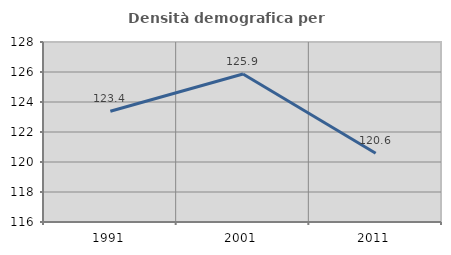
| Category | Densità demografica |
|---|---|
| 1991.0 | 123.379 |
| 2001.0 | 125.869 |
| 2011.0 | 120.578 |